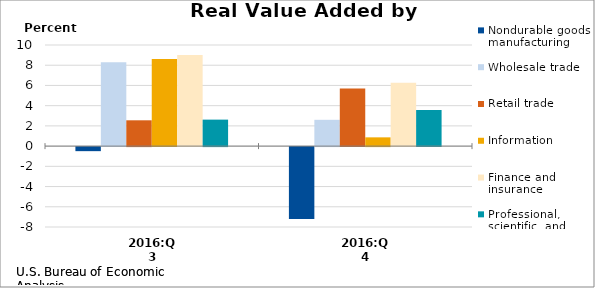
| Category | Nondurable goods manufacturing | Wholesale trade | Retail trade | Information | Finance and insurance | Professional, scientific, and technical services |
|---|---|---|---|---|---|---|
| 2016:Q3 | -0.4 | 8.3 | 2.553 | 8.604 | 9.005 | 2.619 |
| 2016:Q4 | -7.1 | 2.6 | 5.7 | 0.866 | 6.276 | 3.572 |